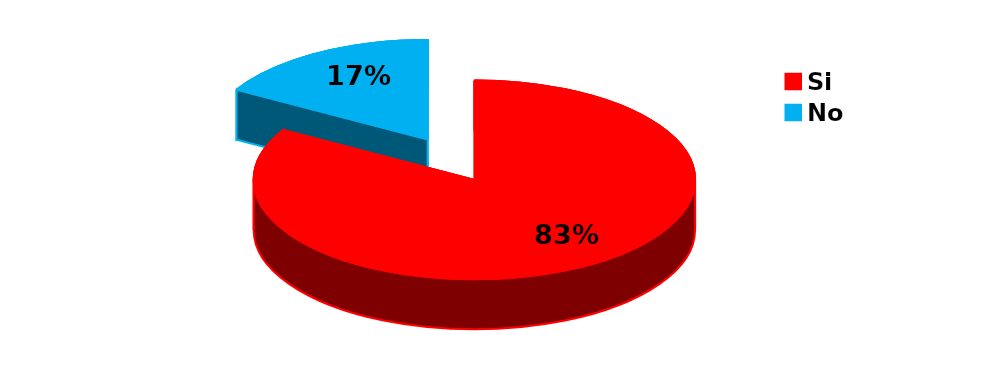
| Category | Series 0 |
|---|---|
| Si | 50 |
| No | 10 |